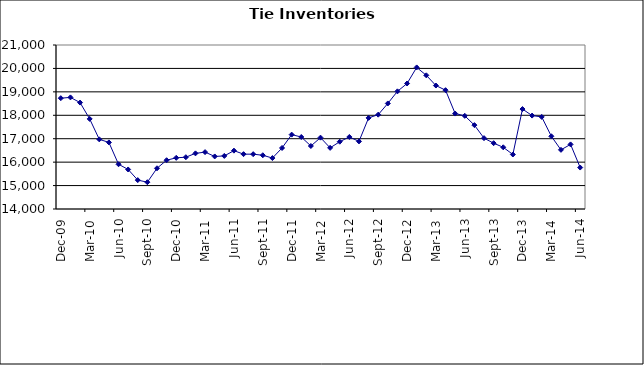
| Category | Series 0 |
|---|---|
| 2005-12-01 | 18730.145 |
| 2006-01-01 | 18763.698 |
| 2006-02-01 | 18542.588 |
| 2006-03-01 | 17845.147 |
| 2006-04-01 | 16973.316 |
| 2006-05-01 | 16842.952 |
| 2006-06-01 | 15910.242 |
| 2006-07-01 | 15687.728 |
| 2006-08-01 | 15233.163 |
| 2006-09-01 | 15144.04 |
| 2006-10-01 | 15738.044 |
| 2006-11-01 | 16082.406 |
| 2006-12-01 | 16184.263 |
| 2007-01-01 | 16210.849 |
| 2007-02-01 | 16374.9 |
| 2007-03-01 | 16427.623 |
| 2007-04-01 | 16243.323 |
| 2007-05-01 | 16265.661 |
| 2007-06-01 | 16490.74 |
| 2007-07-01 | 16341.093 |
| 2007-08-01 | 16340.182 |
| 2007-09-01 | 16293.721 |
| 2007-10-01 | 16174.439 |
| 2007-11-01 | 16604.619 |
| 2007-12-01 | 17174.1 |
| 2008-01-01 | 17073.635 |
| 2008-02-01 | 16688.385 |
| 2008-03-01 | 17045.282 |
| 2008-04-01 | 16609.275 |
| 2008-05-01 | 16872.655 |
| 2008-06-01 | 17075.69 |
| 2008-07-01 | 16885.134 |
| 2008-08-01 | 17888.283 |
| 2008-09-01 | 18026.639 |
| 2008-10-01 | 18505.135 |
| 2008-11-01 | 19022.406 |
| 2008-12-01 | 19357 |
| 2009-01-01 | 20042.926 |
| 2009-02-01 | 19706 |
| 2009-03-01 | 19269.488 |
| 2009-04-01 | 19071.685 |
| 2009-05-01 | 18074.13 |
| 2009-06-01 | 17978.003 |
| 2009-07-01 | 17579.497 |
| 2009-08-01 | 17023.982 |
| 2009-09-01 | 16809.111 |
| 2009-10-01 | 16633.924 |
| 2009-11-01 | 16326.449 |
| 2009-12-01 | 18266.751 |
| 2010-01-01 | 17987.459 |
| 2010-02-01 | 17930.527 |
| 2010-03-01 | 17104.504 |
| 2010-04-01 | 16525.456 |
| 2010-05-01 | 16757.127 |
| 2010-06-01 | 15768.938 |